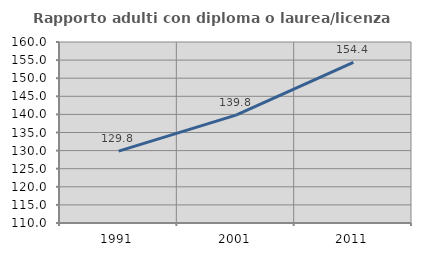
| Category | Rapporto adulti con diploma o laurea/licenza media  |
|---|---|
| 1991.0 | 129.839 |
| 2001.0 | 139.81 |
| 2011.0 | 154.365 |